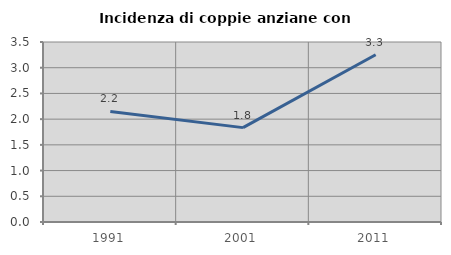
| Category | Incidenza di coppie anziane con figli |
|---|---|
| 1991.0 | 2.151 |
| 2001.0 | 1.835 |
| 2011.0 | 3.252 |